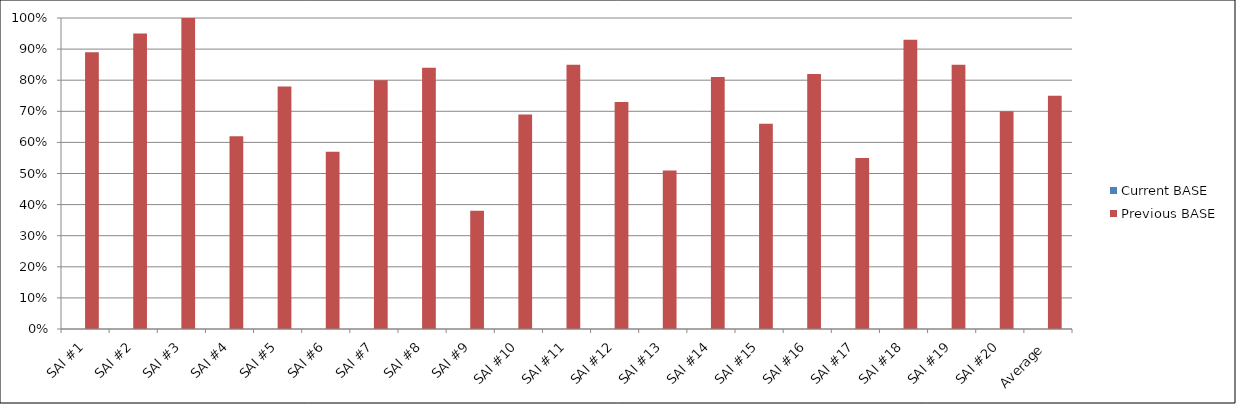
| Category | Current BASE | Previous BASE |
|---|---|---|
| SAI #1 | 0 | 0.89 |
| SAI #2 | 0 | 0.95 |
| SAI #3 | 0 | 1 |
| SAI #4 | 0 | 0.62 |
| SAI #5 | 0 | 0.78 |
| SAI #6 | 0 | 0.57 |
| SAI #7 | 0 | 0.8 |
| SAI #8 | 0 | 0.84 |
| SAI #9 | 0 | 0.38 |
| SAI #10 | 0 | 0.69 |
| SAI #11 | 0 | 0.85 |
| SAI #12 | 0 | 0.73 |
| SAI #13 | 0 | 0.51 |
| SAI #14 | 0 | 0.81 |
| SAI #15 | 0 | 0.66 |
| SAI #16 | 0 | 0.82 |
| SAI #17 | 0 | 0.55 |
| SAI #18 | 0 | 0.93 |
| SAI #19 | 0 | 0.85 |
| SAI #20 | 0 | 0.7 |
| Average | 0 | 0.75 |